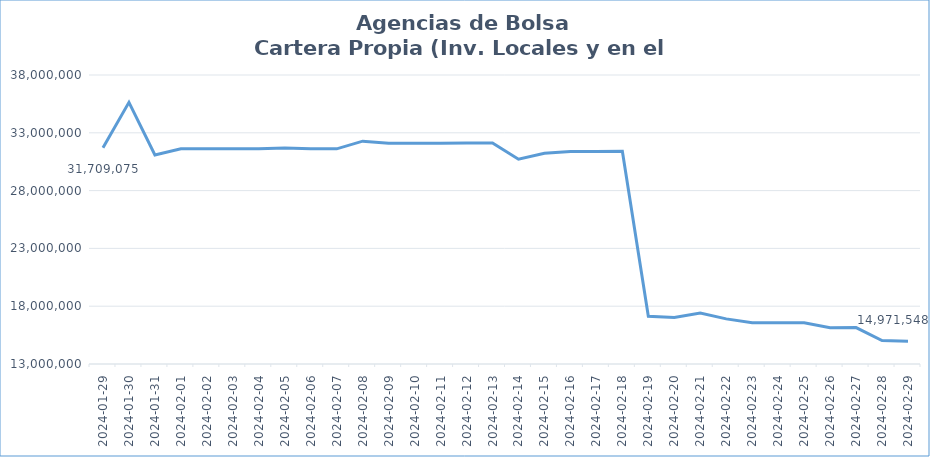
| Category | TOTAL |
|---|---|
| 2024-01-29 | 31709074.57 |
| 2024-01-30 | 35635167.03 |
| 2024-01-31 | 31079260.87 |
| 2024-02-01 | 31621846.04 |
| 2024-02-02 | 31621280.77 |
| 2024-02-03 | 31624824.28 |
| 2024-02-04 | 31628400.01 |
| 2024-02-05 | 31693827.95 |
| 2024-02-06 | 31613585.41 |
| 2024-02-07 | 31610881.02 |
| 2024-02-08 | 32278151.26 |
| 2024-02-09 | 32100516.4 |
| 2024-02-10 | 32101073.54 |
| 2024-02-11 | 32104548.59 |
| 2024-02-12 | 32108055.19 |
| 2024-02-13 | 32111563.95 |
| 2024-02-14 | 30710482.38 |
| 2024-02-15 | 31225147.08 |
| 2024-02-16 | 31388031.95 |
| 2024-02-17 | 31391484.98 |
| 2024-02-18 | 31394925.53 |
| 2024-02-19 | 17125374.76 |
| 2024-02-20 | 17029707.48 |
| 2024-02-21 | 17407193.82 |
| 2024-02-22 | 16902277.33 |
| 2024-02-23 | 16559265.07 |
| 2024-02-24 | 16560403.81 |
| 2024-02-25 | 16561561.53 |
| 2024-02-26 | 16128433.58 |
| 2024-02-27 | 16150492.57 |
| 2024-02-28 | 15030682.59 |
| 2024-02-29 | 14971547.59 |